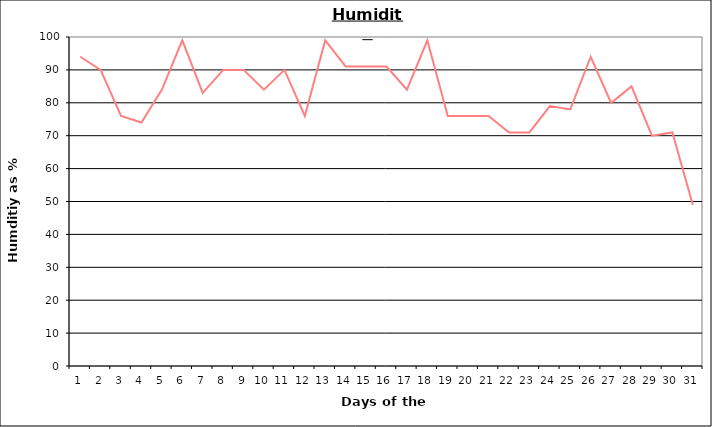
| Category | Series 0 |
|---|---|
| 0 | 94 |
| 1 | 90 |
| 2 | 76 |
| 3 | 74 |
| 4 | 84 |
| 5 | 99 |
| 6 | 83 |
| 7 | 90 |
| 8 | 90 |
| 9 | 84 |
| 10 | 90 |
| 11 | 76 |
| 12 | 99 |
| 13 | 91 |
| 14 | 91 |
| 15 | 91 |
| 16 | 84 |
| 17 | 99 |
| 18 | 76 |
| 19 | 76 |
| 20 | 76 |
| 21 | 71 |
| 22 | 71 |
| 23 | 79 |
| 24 | 78 |
| 25 | 94 |
| 26 | 80 |
| 27 | 85 |
| 28 | 70 |
| 29 | 71 |
| 30 | 49 |